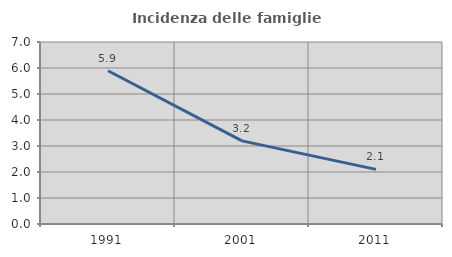
| Category | Incidenza delle famiglie numerose |
|---|---|
| 1991.0 | 5.894 |
| 2001.0 | 3.198 |
| 2011.0 | 2.102 |